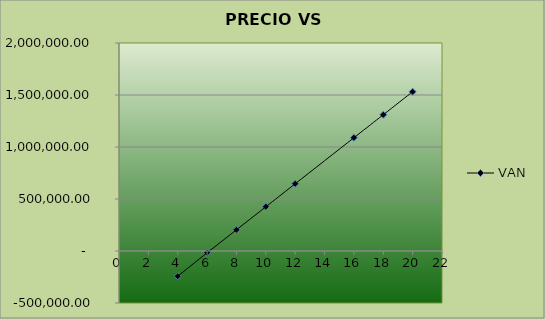
| Category | VAN |
|---|---|
| 4.0 | -242862.266 |
| 6.0 | -17248.667 |
| 8.0 | 204005.388 |
| 10.0 | 425259.444 |
| 12.0 | 646513.5 |
| 16.0 | 1089021.611 |
| 18.0 | 1310275.667 |
| 20.0 | 1531529.723 |